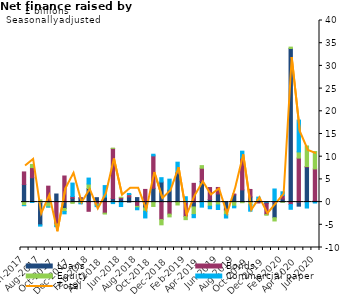
| Category | Loans | Bonds | Equity | Commercial paper |
|---|---|---|---|---|
| Jun-2017 | 3.868 | 2.776 | -0.77 | -0.017 |
| Jul-2017 | 5.36 | 2.238 | 0.7 | -0.09 |
| Aug-2017 | -5.015 | 0.002 | 0.475 | -0.276 |
| Sep-2017 | -0.177 | 3.51 | -0.887 | -0.044 |
| Oct-2017 | 1.783 | -4.847 | -0.371 | -0.197 |
| Nov-2017 | -1.412 | 5.749 | -0.676 | -0.5 |
| Dec-2017 | 0.859 | 0.379 | -0.276 | 2.954 |
| Jan-2018 | 0.884 | 0.093 | -0.269 | -0.116 |
| Feb-2018 | 2.985 | -2.027 | 0.997 | 1.309 |
| Mar-2018 | 0.974 | -0.433 | -0.214 | -0.357 |
| Apr-2018 | 1.106 | -2.435 | -0.194 | 2.532 |
| May-2018 | 0.796 | 11.031 | 0.042 | -0.33 |
| Jun-2018 | 0.718 | 0.294 | 0.056 | -0.977 |
| Jul-2018 | 1.138 | 0.494 | 0.041 | 0.233 |
| Aug-2018 | 0.989 | -0.932 | -0.326 | -0.431 |
| Sep-2018 | -1.276 | 2.795 | -0.732 | -1.484 |
| Oct-2018 | 3.043 | 7.138 | -0.958 | 0.363 |
| Nov-2018 | 4.421 | -3.846 | -1.159 | 0.958 |
| Dec-2018 | 2.649 | -2.65 | -0.607 | 2.407 |
| Jan-2019 | 6.318 | 0.161 | -0.634 | 2.312 |
| Feb-2019 | -0.093 | -3.084 | -0.689 | 1.181 |
| Mar-2019 | -1.069 | 4.131 | -1.684 | -0.683 |
| Apr-2019 | 4.542 | 2.92 | 0.57 | -1.109 |
| May-2019 | 0.585 | 2.622 | -0.905 | -0.561 |
| Jun-2019 | 1.791 | 1.437 | -0.625 | -1.001 |
| Jul-2019 | -1.641 | -0.281 | -0.842 | -0.742 |
| Aug-2019 | 1.597 | 0.174 | -0.907 | -0.357 |
| Sep-2019 | 2.687 | 6.981 | -0.133 | 1.548 |
| Oct-2019 | 1.135 | 1.651 | -0.588 | -1.416 |
| Nov-2019 | 0.433 | -0.195 | 0.013 | 0.654 |
| Dec-2019 | -0.329 | -2.415 | -0.15 | 0.031 |
| Jan-2020 | -3.44 | 0.155 | -0.718 | 2.731 |
| Feb-2020 | 0.681 | 0.764 | -0.024 | 0.826 |
| Mar-2020 | 33.831 | -0.54 | 0.307 | -1.041 |
| Apr-2020 | -0.894 | 9.698 | 1.354 | 7.014 |
| May-2020 | 7.716 | 0.131 | 4.518 | -1.303 |
| Jun-2020 | 0.35 | 6.961 | 3.823 | -0.204 |